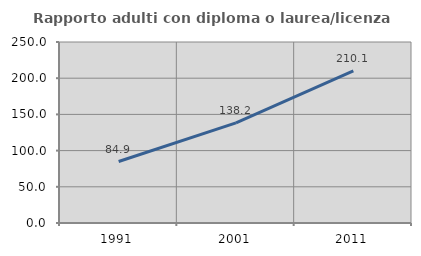
| Category | Rapporto adulti con diploma o laurea/licenza media  |
|---|---|
| 1991.0 | 84.932 |
| 2001.0 | 138.202 |
| 2011.0 | 210.112 |